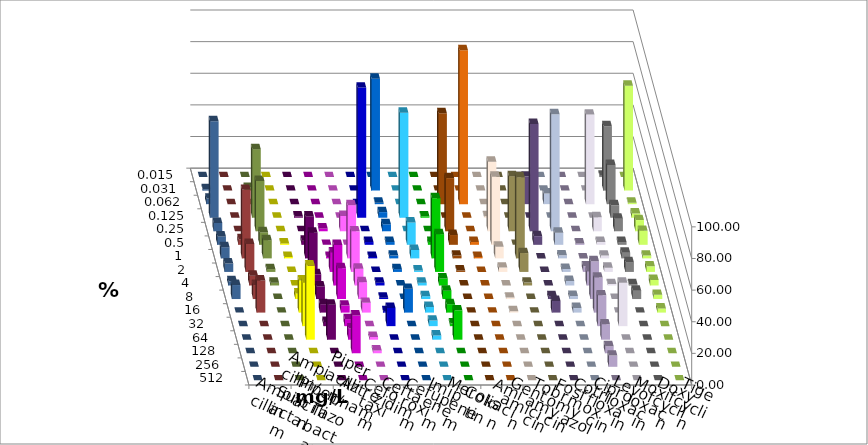
| Category | Ampicillin | Ampicillin/ Sulbactam | Piperacillin | Piperacillin/ Tazobactam | Aztreonam | Cefotaxim | Ceftazidim | Cefuroxim | Imipenem | Meropenem | Colistin | Amikacin | Gentamicin | Tobramycin | Fosfomycin | Cotrimoxazol | Ciprofloxacin | Levofloxacin | Moxifloxacin | Doxycyclin | Tigecyclin |
|---|---|---|---|---|---|---|---|---|---|---|---|---|---|---|---|---|---|---|---|---|---|
| 0.015 | 0 | 0 | 0 | 0 | 0 | 0 | 0 | 0 | 0 | 0 | 0 | 0 | 0 | 0 | 0 | 0 | 0.885 | 0 | 0 | 0 | 0 |
| 0.031 | 0 | 0 | 0 | 0 | 0 | 70.796 | 0 | 0 | 0 | 0 | 0 | 0 | 0 | 0 | 0 | 0 | 40.708 | 66.372 | 0.885 | 0 | 1.77 |
| 0.062 | 0 | 0 | 0 | 0 | 0 | 0.885 | 0 | 0 | 57.522 | 97.345 | 0 | 0 | 17.431 | 6.731 | 0 | 56.637 | 24.779 | 0.885 | 3.54 | 0 | 0 |
| 0.125 | 0 | 0.885 | 0 | 0 | 82.301 | 3.54 | 66.372 | 0.885 | 0 | 0 | 0.917 | 0 | 0 | 0 | 0 | 0 | 7.965 | 2.655 | 61.062 | 0 | 43.363 |
| 0.25 | 0 | 0 | 1.77 | 9.735 | 0 | 4.425 | 0 | 0 | 33.628 | 0 | 44.037 | 34.862 | 67.89 | 74.038 | 0 | 8.85 | 7.965 | 7.08 | 5.31 | 0 | 31.858 |
| 0.5 | 0.885 | 2.655 | 0 | 0 | 1.77 | 1.77 | 14.159 | 1.77 | 6.195 | 1.77 | 43.119 | 0 | 5.505 | 7.692 | 0.885 | 1.77 | 1.77 | 8.85 | 5.31 | 3.54 | 7.965 |
| 1.0 | 0.885 | 26.549 | 0.885 | 33.628 | 0.885 | 1.77 | 5.31 | 38.053 | 1.77 | 0.885 | 7.339 | 51.376 | 0 | 1.923 | 0 | 1.77 | 3.54 | 1.77 | 7.08 | 43.363 | 11.504 |
| 2.0 | 0 | 24.779 | 12.389 | 25.664 | 0 | 1.77 | 0.885 | 23.894 | 0.885 | 0 | 2.752 | 11.927 | 0 | 1.923 | 3.54 | 2.655 | 6.195 | 3.54 | 5.31 | 17.699 | 1.77 |
| 4.0 | 0 | 7.08 | 25.664 | 10.619 | 1.77 | 0 | 1.77 | 4.425 | 0 | 0 | 0 | 1.835 | 0 | 2.885 | 8.85 | 0.885 | 0.885 | 3.54 | 2.655 | 6.195 | 1.77 |
| 8.0 | 3.54 | 7.965 | 19.469 | 10.619 | 0.885 | 0 | 1.77 | 5.31 | 0 | 0 | 0.917 | 0 | 1.835 | 1.923 | 23.894 | 0 | 5.31 | 2.655 | 8.85 | 8.85 | 0 |
| 16.0 | 20.354 | 5.31 | 4.425 | 6.195 | 0.885 | 15.044 | 3.54 | 5.31 | 0 | 0 | 0.917 | 0 | 7.339 | 2.885 | 22.124 | 0 | 0 | 2.655 | 0 | 20.354 | 0 |
| 32.0 | 27.434 | 2.655 | 4.425 | 0 | 11.504 | 0 | 3.54 | 1.77 | 0 | 0 | 0 | 0 | 0 | 0 | 19.469 | 27.434 | 0 | 0 | 0 | 0 | 0 |
| 64.0 | 46.903 | 22.124 | 7.08 | 1.77 | 0 | 0 | 2.655 | 18.584 | 0 | 0 | 0 | 0 | 0 | 0 | 9.735 | 0 | 0 | 0 | 0 | 0 | 0 |
| 128.0 | 0 | 0 | 23.894 | 1.77 | 0 | 0 | 0 | 0 | 0 | 0 | 0 | 0 | 0 | 0 | 4.425 | 0 | 0 | 0 | 0 | 0 | 0 |
| 256.0 | 0 | 0 | 0 | 0 | 0 | 0 | 0 | 0 | 0 | 0 | 0 | 0 | 0 | 0 | 7.08 | 0 | 0 | 0 | 0 | 0 | 0 |
| 512.0 | 0 | 0 | 0 | 0 | 0 | 0 | 0 | 0 | 0 | 0 | 0 | 0 | 0 | 0 | 0 | 0 | 0 | 0 | 0 | 0 | 0 |